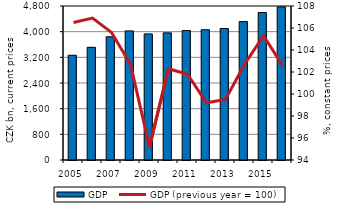
| Category | GDP |
|---|---|
| 2005.0 | 3264.9 |
| 2006.0 | 3512.8 |
| 2007.0 | 3840.1 |
| 2008.0 | 4024.1 |
| 2009.0 | 3930.4 |
| 2010.0 | 3962.5 |
| 2011.0 | 4033.8 |
| 2012.0 | 4059.9 |
| 2013.0 | 4098.1 |
| 2014.0 | 4313.8 |
| 2015.0 | 4595.8 |
| 2016.0 | 4773.2 |